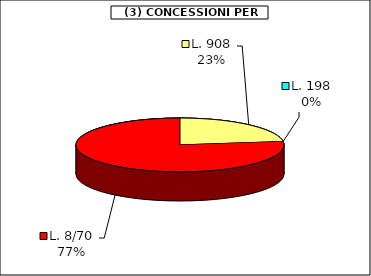
| Category | Series 0 |
|---|---|
| L. 908 | 29479.625 |
| L. 198 | 0 |
| L. 8/70 | 98865 |